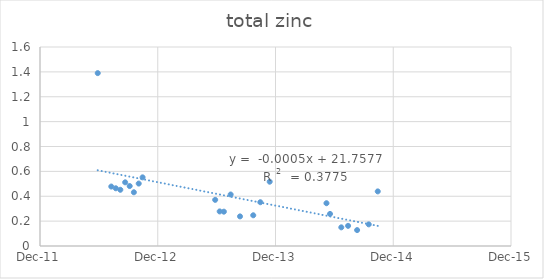
| Category | Series 0 |
|---|---|
| 41059.0 | 1.39 |
| 41101.0 | 0.478 |
| 41115.0 | 0.464 |
| 41129.0 | 0.452 |
| 41144.0 | 0.512 |
| 41158.0 | 0.482 |
| 41171.0 | 0.432 |
| 41186.0 | 0.502 |
| 41198.0 | 0.552 |
| 41423.0 | 0.371 |
| 41437.0 | 0.278 |
| 41450.0 | 0.276 |
| 41471.0 | 0.414 |
| 41500.0 | 0.238 |
| 41541.0 | 0.247 |
| 41563.0 | 0.352 |
| 41592.0 | 0.517 |
| 41768.0 | 0.344 |
| 41779.0 | 0.258 |
| 41814.0 | 0.15 |
| 41835.0 | 0.162 |
| 41863.0 | 0.128 |
| 41899.0 | 0.174 |
| 41927.0 | 0.439 |